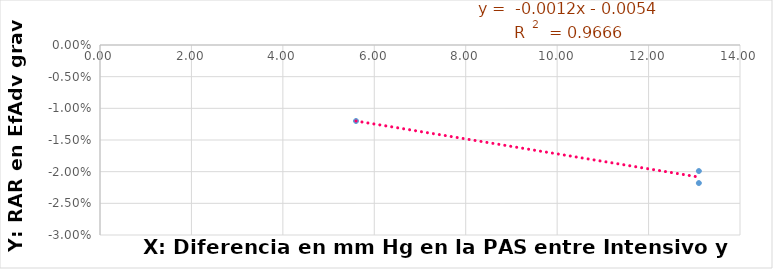
| Category | Y = RAR en EfAdv grav atrib |
|---|---|
| 13.1 | -0.02 |
| 5.6 | -0.012 |
| 13.1 | -0.022 |